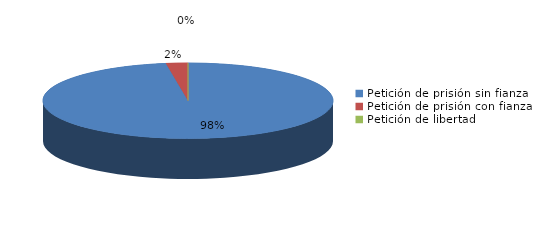
| Category | Series 0 |
|---|---|
| Petición de prisión sin fianza | 40 |
| Petición de prisión con fianza | 1 |
| Petición de libertad | 0 |